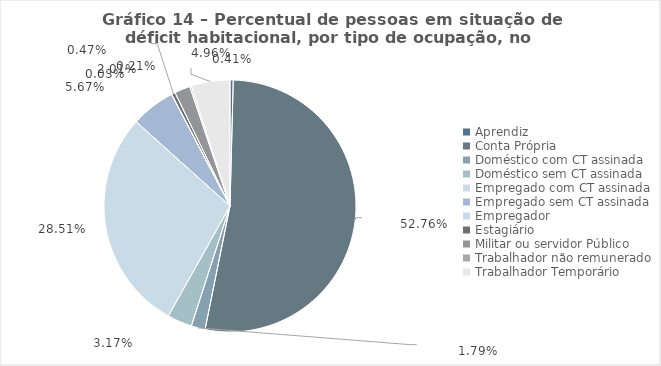
| Category | Series 0 |
|---|---|
| Aprendiz | 0.004 |
| Conta Própria | 0.528 |
| Doméstico com CT assinada | 0.018 |
| Doméstico sem CT assinada | 0.032 |
| Empregado com CT assinada | 0.285 |
| Empregado sem CT assinada | 0.057 |
| Empregador | 0 |
| Estagiário | 0.005 |
| Militar ou servidor Público | 0.02 |
| Trabalhador não remunerado | 0.002 |
| Trabalhador Temporário | 0.05 |